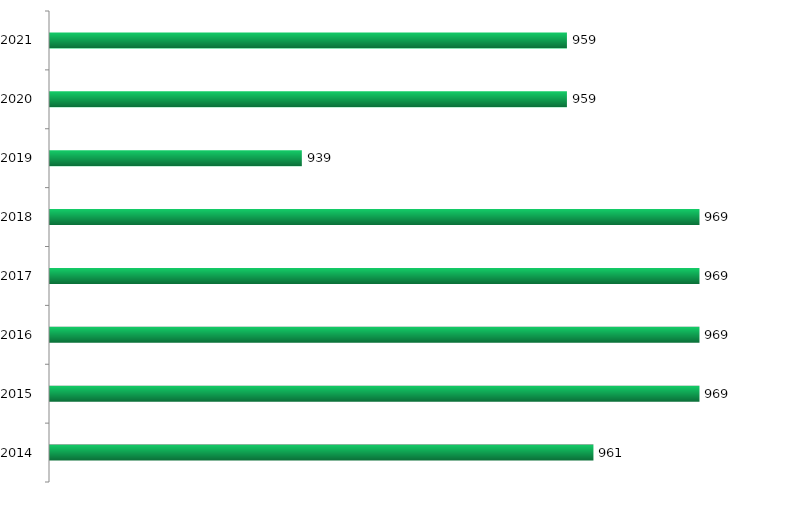
| Category | Vagas ofertadas |
|---|---|
| 2014.0 | 961 |
| 2015.0 | 969 |
| 2016.0 | 969 |
| 2017.0 | 969 |
| 2018.0 | 969 |
| 2019.0 | 939 |
| 2020.0 | 959 |
| 2021.0 | 959 |